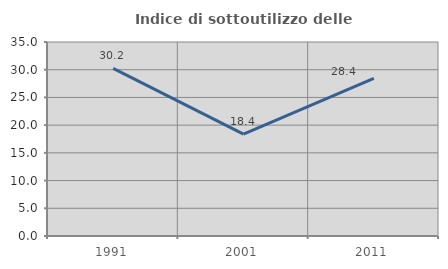
| Category | Indice di sottoutilizzo delle abitazioni  |
|---|---|
| 1991.0 | 30.233 |
| 2001.0 | 18.391 |
| 2011.0 | 28.421 |